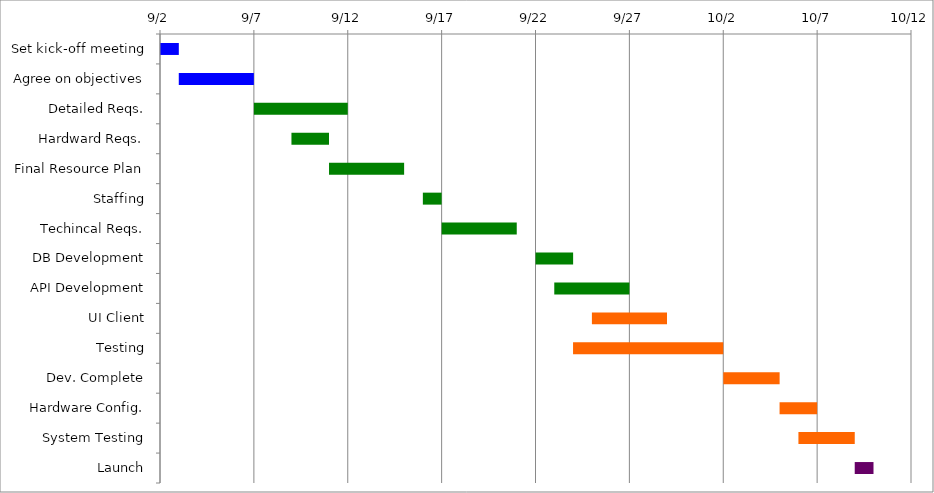
| Category | Start | Days |
|---|---|---|
| Set kick-off meeting | 2015-09-02 | 1 |
| Agree on objectives | 2015-09-03 | 4 |
| Detailed Reqs. | 2015-09-07 | 5 |
| Hardward Reqs. | 2015-09-09 | 2 |
| Final Resource Plan | 2015-09-11 | 4 |
| Staffing | 2015-09-16 | 1 |
| Techincal Reqs. | 2015-09-17 | 4 |
| DB Development | 2015-09-22 | 2 |
| API Development | 2015-09-23 | 4 |
| UI Client | 2015-09-25 | 4 |
| Testing | 2015-09-24 | 8 |
| Dev. Complete | 2015-10-02 | 3 |
| Hardware Config. | 2015-10-05 | 2 |
| System Testing | 2015-10-06 | 3 |
| Launch | 2015-10-09 | 1 |